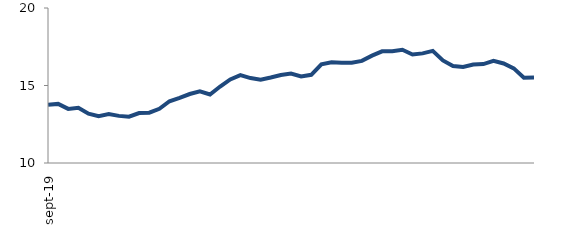
| Category | Series 0 |
|---|---|
| 2019-09-01 | 13.75 |
| 2019-10-01 | 13.812 |
| 2019-11-01 | 13.492 |
| 2019-12-01 | 13.558 |
| 2020-01-01 | 13.183 |
| 2020-02-01 | 13.023 |
| 2020-03-01 | 13.158 |
| 2020-04-01 | 13.04 |
| 2020-05-01 | 12.985 |
| 2020-06-01 | 13.222 |
| 2020-07-01 | 13.243 |
| 2020-08-01 | 13.494 |
| 2020-09-01 | 13.983 |
| 2020-10-01 | 14.201 |
| 2020-11-01 | 14.451 |
| 2020-12-01 | 14.626 |
| 2021-01-01 | 14.42 |
| 2021-02-01 | 14.935 |
| 2021-03-01 | 15.393 |
| 2021-04-01 | 15.673 |
| 2021-05-01 | 15.479 |
| 2021-06-01 | 15.374 |
| 2021-07-01 | 15.513 |
| 2021-08-01 | 15.678 |
| 2021-09-01 | 15.774 |
| 2021-10-01 | 15.578 |
| 2021-11-01 | 15.69 |
| 2021-12-01 | 16.364 |
| 2022-01-01 | 16.498 |
| 2022-02-01 | 16.464 |
| 2022-03-01 | 16.471 |
| 2022-04-01 | 16.588 |
| 2022-05-01 | 16.925 |
| 2022-06-01 | 17.203 |
| 2022-07-01 | 17.216 |
| 2022-08-01 | 17.305 |
| 2022-09-01 | 16.996 |
| 2022-10-01 | 17.071 |
| 2022-11-01 | 17.231 |
| 2022-12-01 | 16.617 |
| 2023-01-01 | 16.261 |
| 2023-02-01 | 16.194 |
| 2023-03-01 | 16.359 |
| 2023-04-01 | 16.383 |
| 2023-05-01 | 16.592 |
| 2023-06-01 | 16.419 |
| 2023-07-01 | 16.107 |
| 2023-08-01 | 15.499 |
| 2023-09-01 | 15.519 |